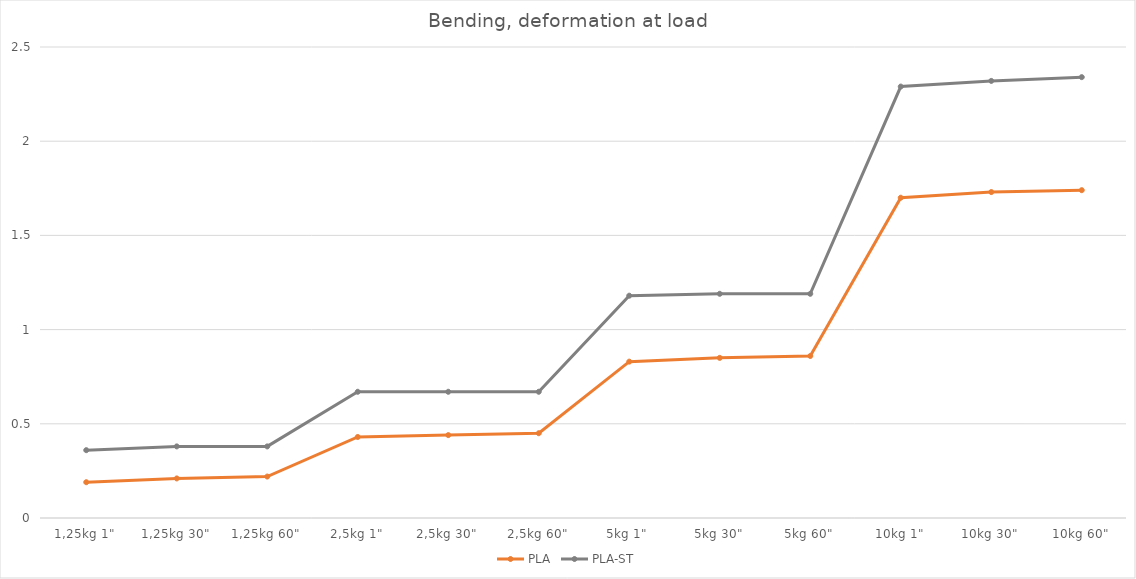
| Category | PLA | PLA-ST |
|---|---|---|
| 1,25kg 1" | 0.19 | 0.36 |
| 1,25kg 30" | 0.21 | 0.38 |
| 1,25kg 60" | 0.22 | 0.38 |
| 2,5kg 1" | 0.43 | 0.67 |
| 2,5kg 30" | 0.44 | 0.67 |
| 2,5kg 60" | 0.45 | 0.67 |
| 5kg 1" | 0.83 | 1.18 |
| 5kg 30" | 0.85 | 1.19 |
| 5kg 60" | 0.86 | 1.19 |
| 10kg 1" | 1.7 | 2.29 |
| 10kg 30" | 1.73 | 2.32 |
| 10kg 60" | 1.74 | 2.34 |